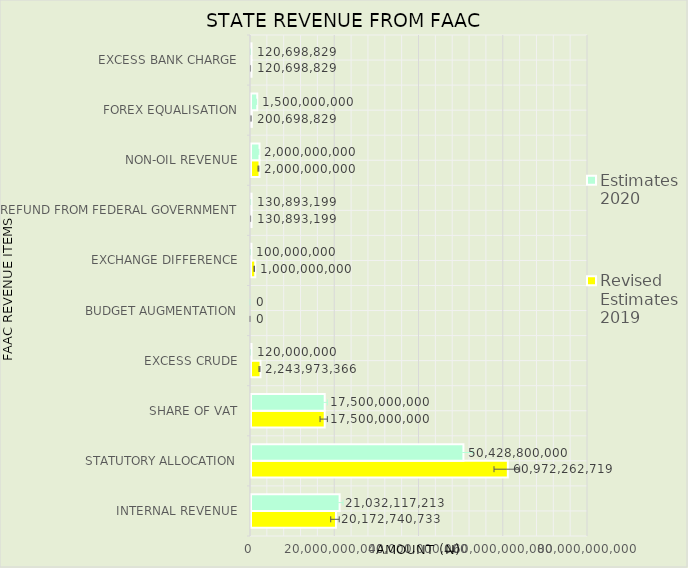
| Category | Revised Estimates 2019 | Estimates 2020 |
|---|---|---|
| INTERNAL REVENUE | 20172740733 | 21032117213 |
| STATUTORY ALLOCATION | 60972262719 | 50428800000 |
| SHARE OF VAT | 17500000000 | 17500000000 |
| EXCESS CRUDE | 2243973366 | 120000000 |
| BUDGET AUGMENTATION | 0 | 0 |
| EXCHANGE DIFFERENCE | 1000000000 | 100000000 |
| REFUND FROM FEDERAL GOVERNMENT | 130893199 | 130893199 |
| NON-OIL REVENUE | 2000000000 | 2000000000 |
| FOREX EQUALISATION | 200698829 | 1500000000 |
| EXCESS BANK CHARGE | 120698829 | 120698829 |